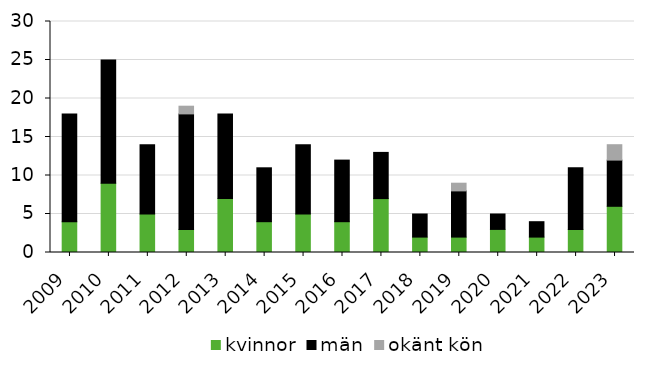
| Category | kvinnor | män | okänt kön |
|---|---|---|---|
| 2009 | 4 | 14 | 0 |
| 2010 | 9 | 16 | 0 |
| 2011 | 5 | 9 | 0 |
| 2012 | 3 | 15 | 1 |
| 2013 | 7 | 11 | 0 |
| 2014 | 4 | 7 | 0 |
| 2015 | 5 | 9 | 0 |
| 2016 | 4 | 8 | 0 |
| 2017 | 7 | 6 | 0 |
| 2018 | 2 | 3 | 0 |
| 2019 | 2 | 6 | 1 |
| 2020 | 3 | 2 | 0 |
| 2021 | 2 | 2 | 0 |
| 2022 | 3 | 8 | 0 |
| 2023 | 6 | 6 | 2 |